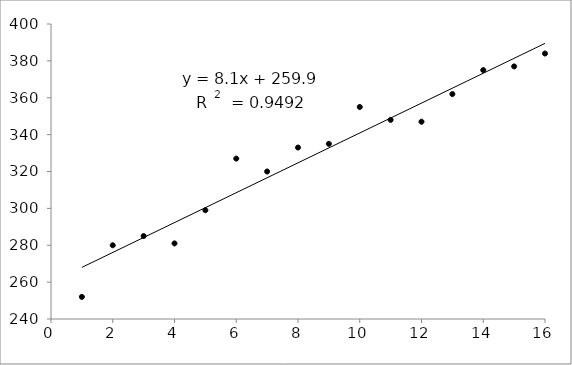
| Category | Data |
|---|---|
| 1.0 | 252 |
| 2.0 | 280 |
| 3.0 | 285 |
| 4.0 | 281 |
| 5.0 | 299 |
| 6.0 | 327 |
| 7.0 | 320 |
| 8.0 | 333 |
| 9.0 | 335 |
| 10.0 | 355 |
| 11.0 | 348 |
| 12.0 | 347 |
| 13.0 | 362 |
| 14.0 | 375 |
| 15.0 | 377 |
| 16.0 | 384 |